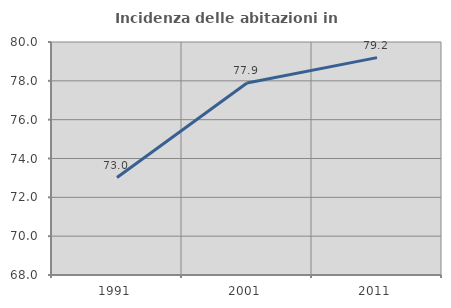
| Category | Incidenza delle abitazioni in proprietà  |
|---|---|
| 1991.0 | 73.02 |
| 2001.0 | 77.888 |
| 2011.0 | 79.195 |